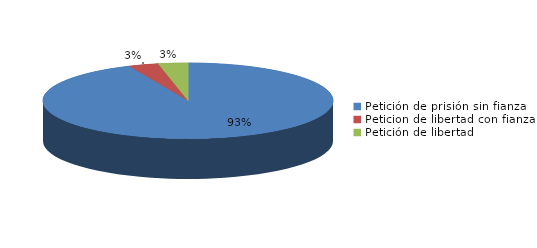
| Category | Series 0 |
|---|---|
| Petición de prisión sin fianza | 366 |
| Peticion de libertad con fianza | 13 |
| Petición de libertad | 13 |